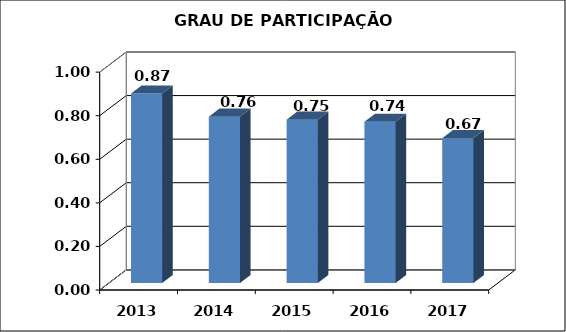
| Category | Series 0 |
|---|---|
| 2013.0 | 0.87 |
| 2014.0 | 0.764 |
| 2015.0 | 0.75 |
| 2016.0 | 0.74 |
| 2017.0 | 0.665 |